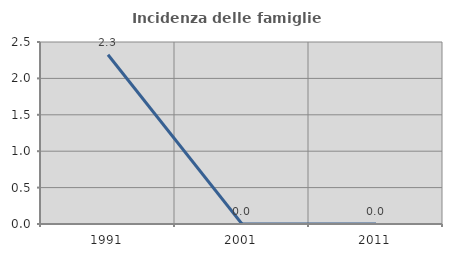
| Category | Incidenza delle famiglie numerose |
|---|---|
| 1991.0 | 2.326 |
| 2001.0 | 0 |
| 2011.0 | 0 |